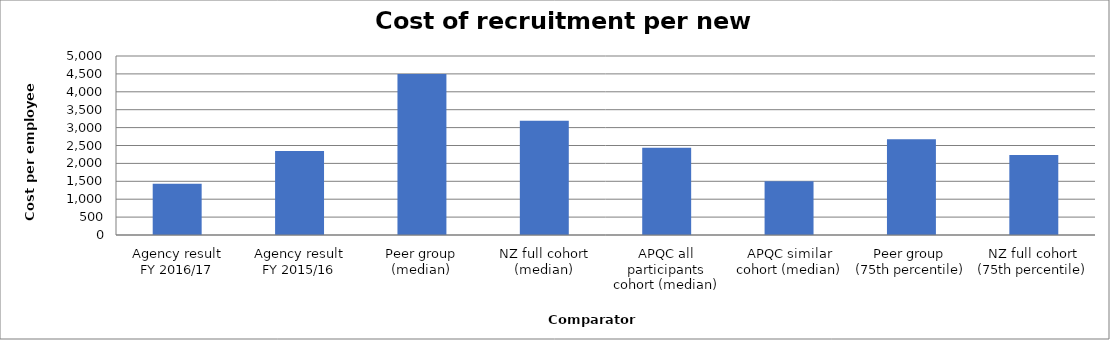
| Category | Result |
|---|---|
| Agency result
FY 2016/17 | 1430.199 |
| Agency result
FY 2015/16 | 2349.594 |
| Peer group (median) | 4496.816 |
| NZ full cohort (median) | 3189.73 |
| APQC all participants cohort (median) | 2434.05 |
| APQC similar cohort (median) | 1500 |
| Peer group 
(75th percentile) | 2672.97 |
| NZ full cohort (75th percentile) | 2233.802 |